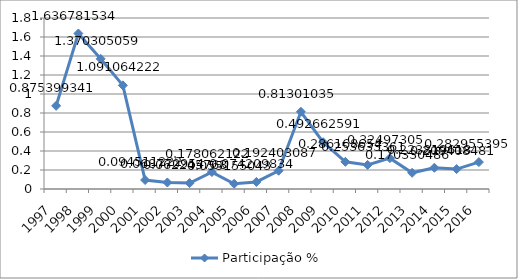
| Category | Participação % |
|---|---|
| 1997.0 | 0.875 |
| 1998.0 | 1.637 |
| 1999.0 | 1.37 |
| 2000.0 | 1.091 |
| 2001.0 | 0.095 |
| 2002.0 | 0.069 |
| 2003.0 | 0.062 |
| 2004.0 | 0.178 |
| 2005.0 | 0.055 |
| 2006.0 | 0.074 |
| 2007.0 | 0.192 |
| 2008.0 | 0.813 |
| 2009.0 | 0.493 |
| 2010.0 | 0.286 |
| 2011.0 | 0.254 |
| 2012.0 | 0.325 |
| 2013.0 | 0.17 |
| 2014.0 | 0.224 |
| 2015.0 | 0.209 |
| 2016.0 | 0.283 |